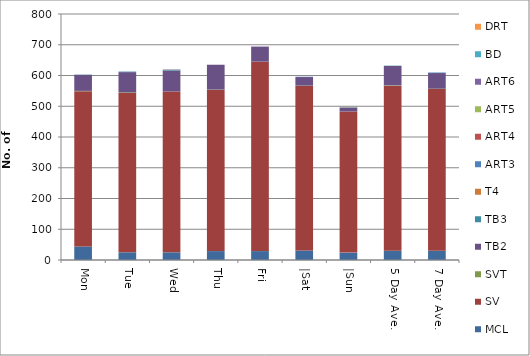
| Category | MCL | SV | SVT | TB2 | TB3 | T4 | ART3 | ART4 | ART5 | ART6 | BD | DRT |
|---|---|---|---|---|---|---|---|---|---|---|---|---|
| Mon | 44 | 505 | 1 | 52 | 1 | 0 | 0 | 0 | 0 | 0 | 0 | 0 |
| Tue | 25 | 518 | 2 | 66 | 1 | 0 | 1 | 0 | 0 | 0 | 0 | 0 |
| Wed | 25 | 523 | 0 | 68 | 2 | 1 | 1 | 0 | 0 | 0 | 0 | 0 |
| Thu | 29 | 524 | 1 | 81 | 0 | 0 | 0 | 0 | 0 | 0 | 0 | 0 |
| Fri | 29 | 616 | 0 | 49 | 0 | 0 | 0 | 0 | 0 | 0 | 0 | 0 |
| |Sat | 31 | 535 | 1 | 28 | 0 | 0 | 1 | 0 | 0 | 0 | 0 | 0 |
| |Sun | 24 | 459 | 0 | 12 | 1 | 1 | 1 | 0 | 0 | 0 | 0 | 0 |
| 5 Day Ave. | 30 | 537 | 1 | 63 | 1 | 0 | 0 | 0 | 0 | 0 | 0 | 0 |
| 7 Day Ave. | 30 | 526 | 1 | 51 | 1 | 0 | 1 | 0 | 0 | 0 | 0 | 0 |